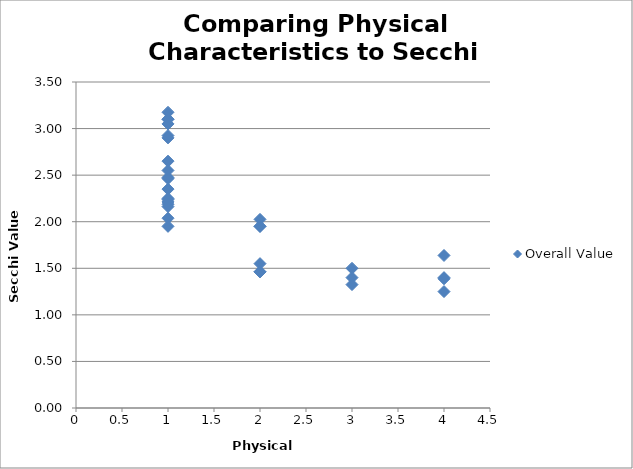
| Category | Overall Value |
|---|---|
| 4.0 | 1.25 |
| 3.0 | 1.325 |
| 4.0 | 1.388 |
| 3.0 | 1.4 |
| 4.0 | 1.4 |
| 2.0 | 1.462 |
| 2.0 | 1.462 |
| 3.0 | 1.5 |
| 2.0 | 1.55 |
| 4.0 | 1.638 |
| 2.0 | 1.95 |
| 1.0 | 1.95 |
| 2.0 | 1.95 |
| 2.0 | 2.025 |
| 1.0 | 2.038 |
| 1.0 | 2.162 |
| 1.0 | 2.188 |
| 1.0 | 2.212 |
| 1.0 | 2.238 |
| 1.0 | 2.25 |
| 1.0 | 2.35 |
| 1.0 | 2.462 |
| 1.0 | 2.475 |
| 1.0 | 2.55 |
| 1.0 | 2.65 |
| 1.0 | 2.9 |
| 1.0 | 2.925 |
| 1.0 | 3.05 |
| 1.0 | 3.1 |
| 1.0 | 3.1 |
| 1.0 | 3.175 |